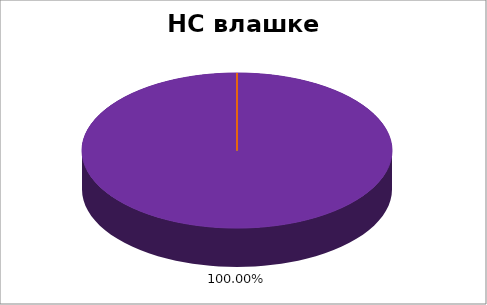
| Category | НС влашке НМ |
|---|---|
| 0 | 0 |
| 1 | 0 |
| 2 | 0 |
| 3 | 0 |
| 4 | 1 |